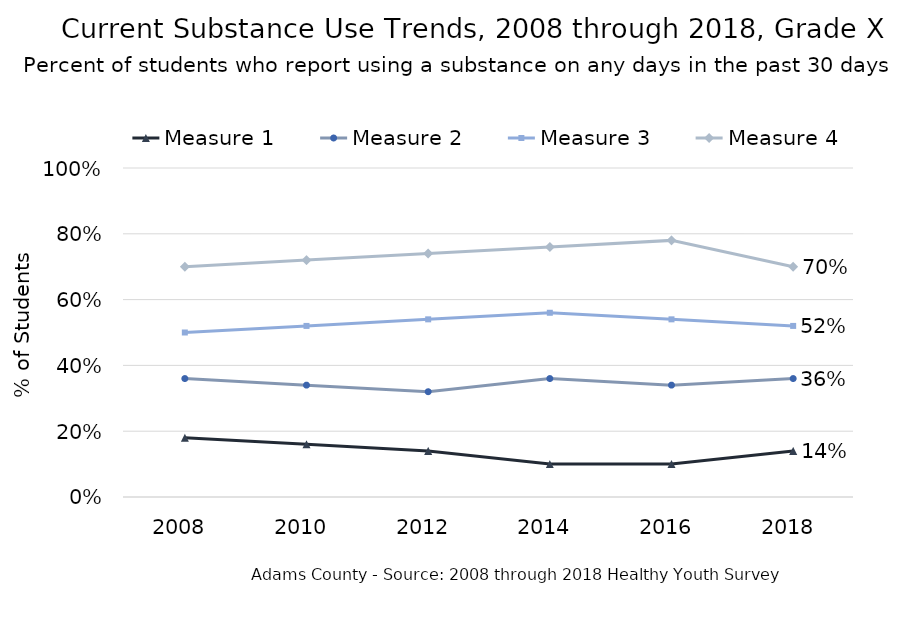
| Category | Measure 1 | Measure 2 | Measure 3 | Measure 4 |
|---|---|---|---|---|
| 2008.0 | 0.18 | 0.36 | 0.5 | 0.7 |
| 2010.0 | 0.16 | 0.34 | 0.52 | 0.72 |
| 2012.0 | 0.14 | 0.32 | 0.54 | 0.74 |
| 2014.0 | 0.1 | 0.36 | 0.56 | 0.76 |
| 2016.0 | 0.1 | 0.34 | 0.54 | 0.78 |
| 2018.0 | 0.14 | 0.36 | 0.52 | 0.7 |